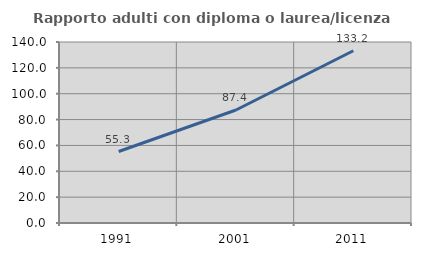
| Category | Rapporto adulti con diploma o laurea/licenza media  |
|---|---|
| 1991.0 | 55.292 |
| 2001.0 | 87.418 |
| 2011.0 | 133.232 |